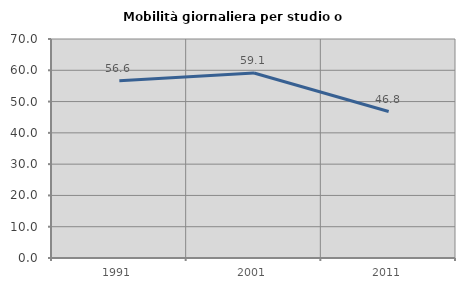
| Category | Mobilità giornaliera per studio o lavoro |
|---|---|
| 1991.0 | 56.642 |
| 2001.0 | 59.13 |
| 2011.0 | 46.815 |